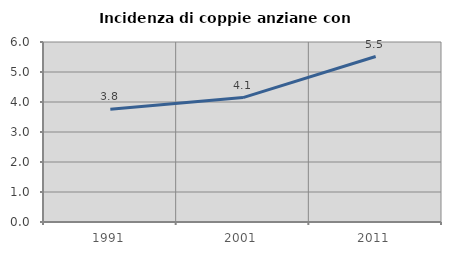
| Category | Incidenza di coppie anziane con figli |
|---|---|
| 1991.0 | 3.761 |
| 2001.0 | 4.147 |
| 2011.0 | 5.516 |